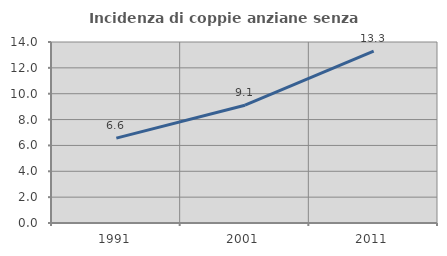
| Category | Incidenza di coppie anziane senza figli  |
|---|---|
| 1991.0 | 6.568 |
| 2001.0 | 9.114 |
| 2011.0 | 13.301 |